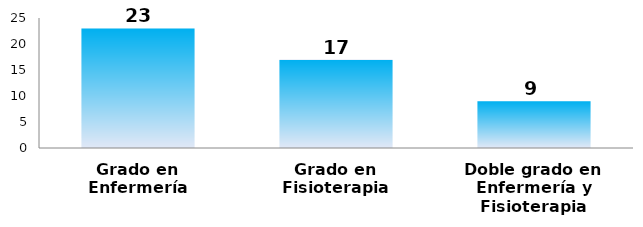
| Category | Series 0 |
|---|---|
| Grado en Enfermería | 23 |
| Grado en Fisioterapia | 17 |
| Doble grado en Enfermería y Fisioterapia | 9 |